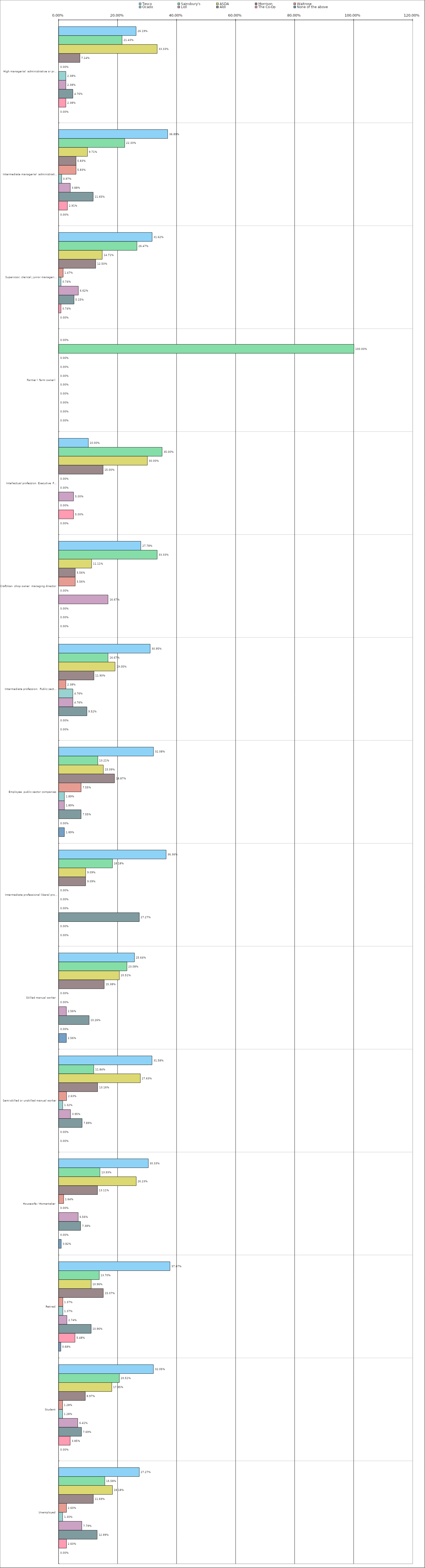
| Category | Tesco | Sainsbury's | ASDA | Morrison | Waitrose | Ocado | Lidl | Aldi | The Co-Op | None of the above |
|---|---|---|---|---|---|---|---|---|---|---|
| 0 | 0.262 | 0.214 | 0.333 | 0.071 | 0 | 0.024 | 0.024 | 0.048 | 0.024 | 0 |
| 1 | 0.369 | 0.223 | 0.097 | 0.058 | 0.058 | 0.01 | 0.039 | 0.116 | 0.029 | 0 |
| 2 | 0.316 | 0.265 | 0.147 | 0.125 | 0.015 | 0.007 | 0.066 | 0.052 | 0.007 | 0 |
| 3 | 0 | 1 | 0 | 0 | 0 | 0 | 0 | 0 | 0 | 0 |
| 4 | 0.1 | 0.35 | 0.3 | 0.15 | 0 | 0 | 0.05 | 0 | 0.05 | 0 |
| 5 | 0.278 | 0.333 | 0.111 | 0.056 | 0.056 | 0 | 0.167 | 0 | 0 | 0 |
| 6 | 0.31 | 0.167 | 0.19 | 0.119 | 0.024 | 0.048 | 0.048 | 0.095 | 0 | 0 |
| 7 | 0.321 | 0.132 | 0.151 | 0.189 | 0.076 | 0.019 | 0.019 | 0.076 | 0 | 0.019 |
| 8 | 0.364 | 0.182 | 0.091 | 0.091 | 0 | 0 | 0 | 0.273 | 0 | 0 |
| 9 | 0.256 | 0.231 | 0.205 | 0.154 | 0 | 0 | 0.026 | 0.103 | 0 | 0.026 |
| 10 | 0.316 | 0.118 | 0.276 | 0.132 | 0.026 | 0.013 | 0.04 | 0.079 | 0 | 0 |
| 11 | 0.303 | 0.139 | 0.262 | 0.131 | 0.016 | 0 | 0.066 | 0.074 | 0 | 0.008 |
| 12 | 0.377 | 0.137 | 0.11 | 0.151 | 0.014 | 0.014 | 0.027 | 0.11 | 0.055 | 0.007 |
| 13 | 0.32 | 0.205 | 0.18 | 0.09 | 0.013 | 0.013 | 0.064 | 0.077 | 0.038 | 0 |
| 14 | 0.273 | 0.156 | 0.182 | 0.117 | 0.026 | 0.013 | 0.078 | 0.13 | 0.026 | 0 |